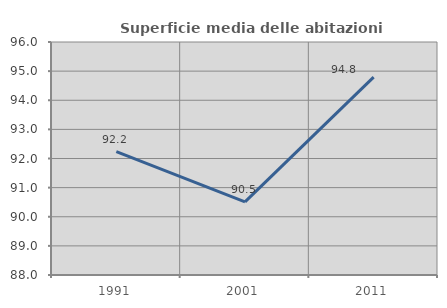
| Category | Superficie media delle abitazioni occupate |
|---|---|
| 1991.0 | 92.236 |
| 2001.0 | 90.513 |
| 2011.0 | 94.795 |